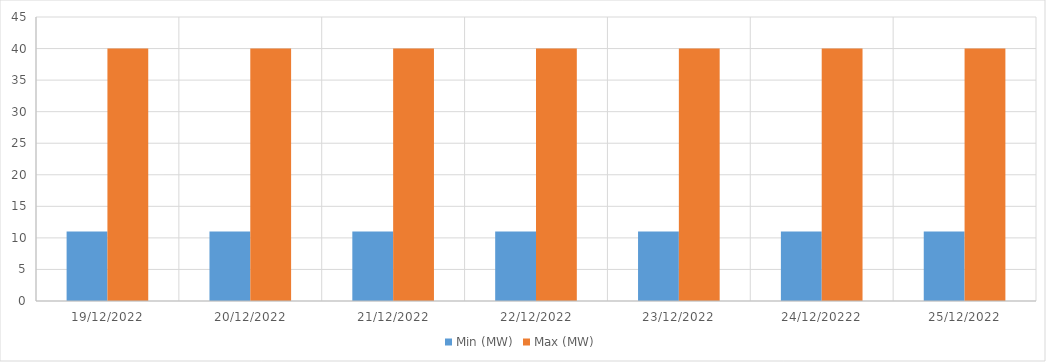
| Category | Min (MW) | Max (MW) |
|---|---|---|
| 19/12/2022 | 11 | 40 |
| 20/12/2022 | 11 | 40 |
| 21/12/2022 | 11 | 40 |
| 22/12/2022 | 11 | 40 |
| 23/12/2022 | 11 | 40 |
| 24/12/20222 | 11 | 40 |
| 25/12/2022 | 11 | 40 |